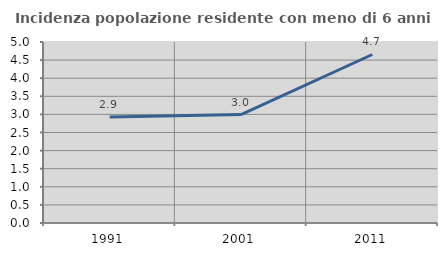
| Category | Incidenza popolazione residente con meno di 6 anni |
|---|---|
| 1991.0 | 2.929 |
| 2001.0 | 2.994 |
| 2011.0 | 4.655 |